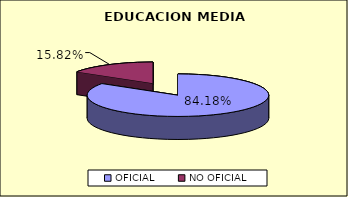
| Category | MEDIA VOCACIONAL | % |
|---|---|---|
| OFICIAL | 70830 | 84.184 |
| NO OFICIAL | 13307 | 15.816 |